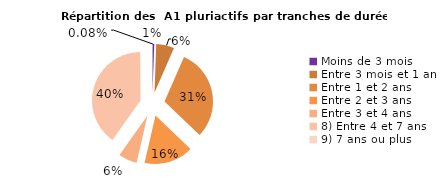
| Category | Series 0 |
|---|---|
| Moins de 3 mois | 199 |
| Entre 3 mois et 1 an | 2073 |
| Entre 1 et 2 ans | 10531 |
| Entre 2 et 3 ans | 5678 |
| Entre 3 et 4 ans | 2140 |
| 8) Entre 4 et 7 ans | 13822 |
| 9) 7 ans ou plus | 27 |